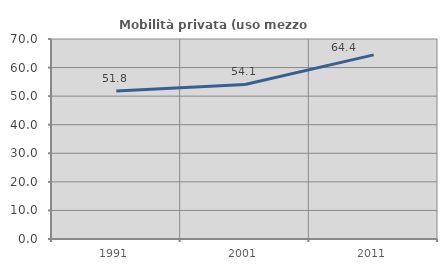
| Category | Mobilità privata (uso mezzo privato) |
|---|---|
| 1991.0 | 51.796 |
| 2001.0 | 54.082 |
| 2011.0 | 64.439 |